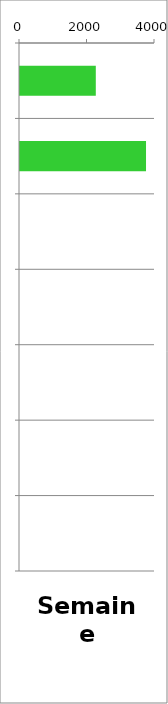
| Category | VL |
|---|---|
| 0 | 2246 |
| 1 | 3734 |
| 2 | 0 |
| 3 | 0 |
| 4 | 0 |
| 5 | 0 |
| 6 | 0 |